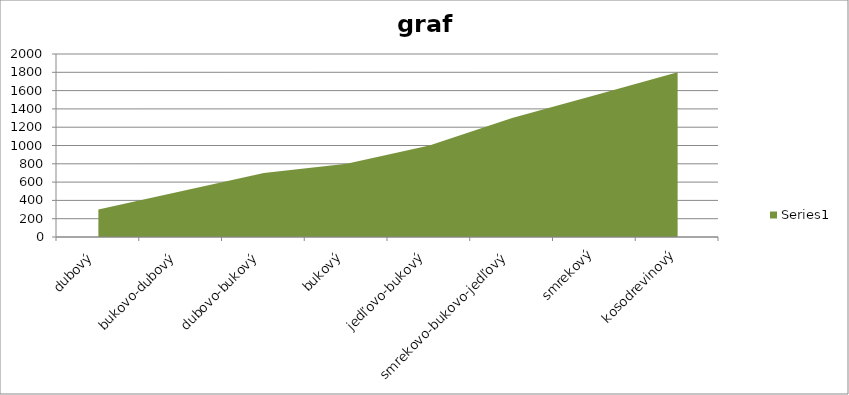
| Category | Series 0 |
|---|---|
| dubový | 300 |
| bukovo-dubový | 500 |
| dubovo-bukový | 700 |
| bukový | 800 |
| jedľovo-bukový | 1000 |
| smrekovo-bukovo-jedľový | 1300 |
| smrekový | 1550 |
| kosodrevinový | 1800 |